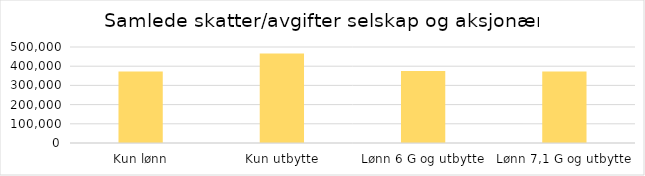
| Category | Series 0 |
|---|---|
| Kun lønn | 372029.283 |
| Kun utbytte | 466176 |
| Lønn 6 G og utbytte | 374464.246 |
| Lønn 7,1 G og utbytte | 372106.38 |